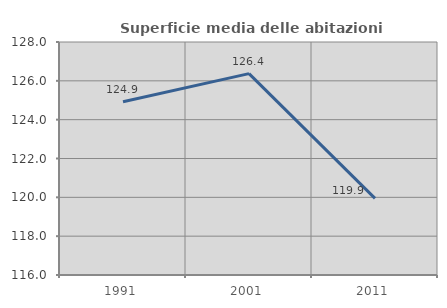
| Category | Superficie media delle abitazioni occupate |
|---|---|
| 1991.0 | 124.922 |
| 2001.0 | 126.372 |
| 2011.0 | 119.946 |